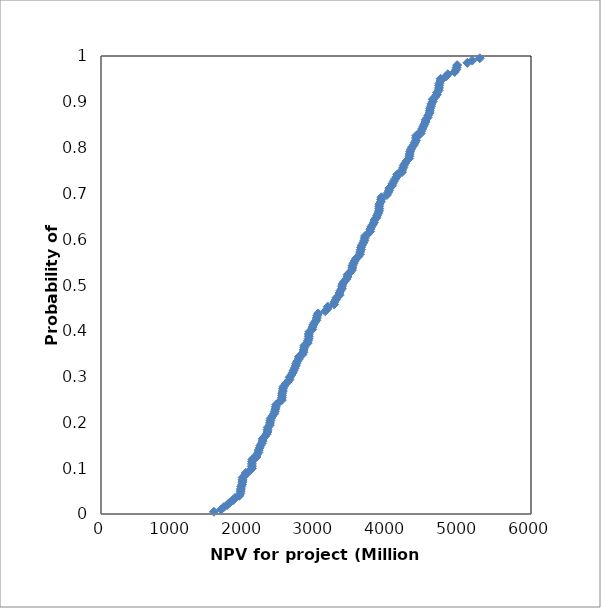
| Category | Series 0 |
|---|---|
| 1944.398953805572 | 0.045 |
| 4587.267730849594 | 0.881 |
| 2242.7944016080482 | 0.154 |
| 4461.608149244243 | 0.831 |
| 2674.5205175249794 | 0.308 |
| 4058.868606117323 | 0.716 |
| 4565.117931485416 | 0.871 |
| 3879.1043588138455 | 0.662 |
| 4306.789960535825 | 0.786 |
| 3278.085256789588 | 0.468 |
| 3163.884670004334 | 0.453 |
| 2169.260575542743 | 0.124 |
| 3340.7734937024006 | 0.488 |
| 2526.2613313471984 | 0.259 |
| 4839.011870039771 | 0.96 |
| 4395.030446251265 | 0.816 |
| 2010.744293273956 | 0.085 |
| 4689.817069493192 | 0.92 |
| 3500.760039140395 | 0.532 |
| 2200.37584220404 | 0.139 |
| 4020.1037771167044 | 0.706 |
| 3884.769913019701 | 0.677 |
| 2759.924507672651 | 0.338 |
| 2323.3462379858265 | 0.184 |
| 3287.145012058605 | 0.473 |
| 3754.4357987707126 | 0.617 |
| 4023.7073025972236 | 0.711 |
| 2075.0673056835335 | 0.095 |
| 2908.0731309265175 | 0.398 |
| 2883.9280663352465 | 0.373 |
| 2811.2544882033276 | 0.348 |
| 2897.400749441964 | 0.383 |
| 2327.0536784946794 | 0.189 |
| 3867.4626234781063 | 0.657 |
| 2355.705767429142 | 0.194 |
| 1949.1054213503558 | 0.05 |
| 2309.5906431343574 | 0.174 |
| 4496.80902612542 | 0.846 |
| 3679.4686426931944 | 0.602 |
| 4718.158513115439 | 0.935 |
| 4935.229584660775 | 0.965 |
| 4557.680964632736 | 0.866 |
| 3011.0392818971586 | 0.428 |
| 2951.1331284549665 | 0.408 |
| 4712.691649257759 | 0.925 |
| 2605.1369070792207 | 0.289 |
| 2363.1362442691216 | 0.204 |
| 1865.8818717243694 | 0.035 |
| 2827.3279597785895 | 0.358 |
| 1973.2667871393132 | 0.07 |
| 3684.6318979275384 | 0.607 |
| 3611.8926715967646 | 0.567 |
| 5284.94191903739 | 0.995 |
| 4395.777694142052 | 0.821 |
| 4605.938205402774 | 0.891 |
| 4465.025949491041 | 0.836 |
| 2537.922704091281 | 0.269 |
| 4629.229343883873 | 0.905 |
| 2107.036858797891 | 0.114 |
| 3853.8383408708446 | 0.652 |
| 3758.0569139140443 | 0.622 |
| 3015.8204705830244 | 0.433 |
| 3422.8738859821524 | 0.512 |
| 2255.2161332391665 | 0.159 |
| 3913.461230307276 | 0.692 |
| 1762.7549671807537 | 0.02 |
| 4103.541166852949 | 0.731 |
| 3506.8669222344215 | 0.537 |
| 4297.686209925645 | 0.776 |
| 3029.9002617032857 | 0.438 |
| 4482.106741353759 | 0.841 |
| 4956.092750229936 | 0.97 |
| 4687.471303307251 | 0.915 |
| 2424.863669299335 | 0.224 |
| 3816.2737157846 | 0.642 |
| 1955.9274161274143 | 0.06 |
| 4512.347990344117 | 0.851 |
| 2898.8919139271393 | 0.388 |
| 2538.820915897929 | 0.274 |
| 2439.5611414509244 | 0.234 |
| 4611.26921061631 | 0.896 |
| 4323.806931053773 | 0.796 |
| 4628.777105788595 | 0.9 |
| 3640.4435922993143 | 0.587 |
| 2369.3787463478848 | 0.209 |
| 2717.9499640991935 | 0.323 |
| 2655.5569077663313 | 0.303 |
| 3509.3305698502368 | 0.542 |
| 1575.9673525821017 | 0.005 |
| 5111.730000879588 | 0.985 |
| 3809.513401223818 | 0.637 |
| 3792.11455380837 | 0.632 |
| 4199.960235565363 | 0.746 |
| 1794.6553266861129 | 0.025 |
| 2633.1304222210374 | 0.299 |
| 3882.079973864059 | 0.667 |
| 1929.8397507969512 | 0.04 |
| 3328.05857496514 | 0.483 |
| 4661.320115068005 | 0.91 |
| 2523.015786026464 | 0.249 |
| 2255.4970657288254 | 0.164 |
| 4218.401247727152 | 0.756 |
| 2213.955215484092 | 0.144 |
| 1975.242793778104 | 0.075 |
| 1712.7087563487285 | 0.015 |
| 4530.01438358211 | 0.861 |
| 4201.228978226936 | 0.751 |
| 2550.267243710917 | 0.279 |
| 3905.6050153226597 | 0.682 |
| 2112.098738489768 | 0.119 |
| 3394.427433952832 | 0.507 |
| 3255.4476095600207 | 0.463 |
| 2738.200504812922 | 0.333 |
| 2390.833166734473 | 0.214 |
| 2947.3268119127447 | 0.403 |
| 2019.827932761631 | 0.09 |
| 3726.125278851635 | 0.612 |
| 4813.126552607068 | 0.955 |
| 4593.265219461841 | 0.886 |
| 3770.1027090351263 | 0.627 |
| 2175.1860483693995 | 0.129 |
| 2104.8718701256507 | 0.1 |
| 1842.2237113912124 | 0.03 |
| 1975.8357168204734 | 0.08 |
| 2724.652508483662 | 0.328 |
| 4365.959172159795 | 0.806 |
| 1676.9933747119949 | 0.01 |
| 2835.187262278341 | 0.363 |
| 3841.746160201523 | 0.647 |
| 4125.3424807286665 | 0.736 |
| 2445.016277608633 | 0.239 |
| 3129.7620217200547 | 0.443 |
| 2357.64032478072 | 0.199 |
| 2839.519270794977 | 0.368 |
| 4377.612184158859 | 0.811 |
| 2899.517857315119 | 0.393 |
| 2285.467180440175 | 0.169 |
| 4716.471085003941 | 0.93 |
| 2105.481627022899 | 0.104 |
| 4738.511730355804 | 0.95 |
| 3363.664602999096 | 0.498 |
| 4312.647833522664 | 0.791 |
| 4265.659628846674 | 0.771 |
| 4722.791697362813 | 0.94 |
| 2433.3978136847372 | 0.229 |
| 3589.7853797966636 | 0.562 |
| 2979.8045399108564 | 0.418 |
| 2702.65261010152 | 0.318 |
| 4304.097098954056 | 0.781 |
| 4005.0383550918646 | 0.701 |
| 3616.502879209647 | 0.572 |
| 3882.8808574772497 | 0.672 |
| 3158.47912826387 | 0.448 |
| 3628.3539289724863 | 0.582 |
| 5180.225054218172 | 0.99 |
| 3556.3401125829587 | 0.557 |
| 3523.489126578451 | 0.547 |
| 2574.521861016122 | 0.284 |
| 4585.485834532394 | 0.876 |
| 2961.2819039551246 | 0.413 |
| 3004.954715681125 | 0.423 |
| 1952.3190706913265 | 0.055 |
| 4736.566195972611 | 0.945 |
| 3370.6466589490346 | 0.502 |
| 4224.965593574403 | 0.761 |
| 2223.4567744712785 | 0.149 |
| 4067.793843669603 | 0.721 |
| 2823.7804003849715 | 0.353 |
| 3472.8360608442204 | 0.527 |
| 3989.115962521196 | 0.697 |
| 4084.733431752693 | 0.726 |
| 2480.8079397951005 | 0.244 |
| 2686.9836636556993 | 0.313 |
| 2630.528492281963 | 0.294 |
| 4339.487269970765 | 0.801 |
| 3361.16039216801 | 0.493 |
| 4528.070551953037 | 0.856 |
| 3252.8799798381397 | 0.458 |
| 3439.732975228775 | 0.522 |
| 2105.571788448856 | 0.109 |
| 4969.804101797094 | 0.98 |
| 3539.5734030892563 | 0.552 |
| 2416.1930263588056 | 0.219 |
| 2762.099978295204 | 0.343 |
| 4244.905346869257 | 0.766 |
| 3327.1628366790464 | 0.478 |
| 2322.4616648482893 | 0.179 |
| 3625.352709660062 | 0.577 |
| 3659.8578965781367 | 0.592 |
| 2196.4110055553115 | 0.134 |
| 4962.144651230974 | 0.975 |
| 3674.4787251644825 | 0.597 |
| 4132.815805458029 | 0.741 |
| 2888.484341970717 | 0.378 |
| 4398.7814433121075 | 0.826 |
| 1968.8018037928605 | 0.065 |
| 3908.413414611511 | 0.687 |
| 2525.0107295037133 | 0.254 |
| 2527.9107142126227 | 0.264 |
| 3438.941369648529 | 0.517 |